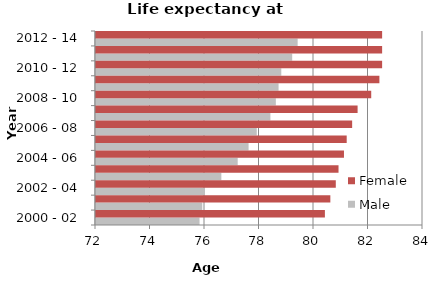
| Category | Male | Female |
|---|---|---|
| 2000 - 02 | 75.8 | 80.4 |
| 2001 - 03 | 75.9 | 80.6 |
| 2002 - 04 | 76 | 80.8 |
| 2003 - 05 | 76.6 | 80.9 |
| 2004 - 06 | 77.2 | 81.1 |
| 2005 - 07 | 77.6 | 81.2 |
| 2006 - 08 | 77.9 | 81.4 |
| 2007 - 09 | 78.4 | 81.6 |
| 2008 - 10 | 78.6 | 82.1 |
| 2009 - 11 | 78.7 | 82.4 |
| 2010 - 12 | 78.8 | 82.5 |
| 2011 - 13 | 79.2 | 82.5 |
| 2012 - 14 | 79.4 | 82.5 |